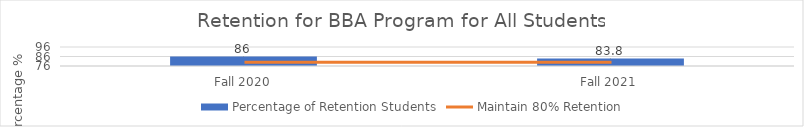
| Category | Percentage of Retention Students |
|---|---|
| Fall 2020 | 86 |
| Fall 2021 | 83.8 |